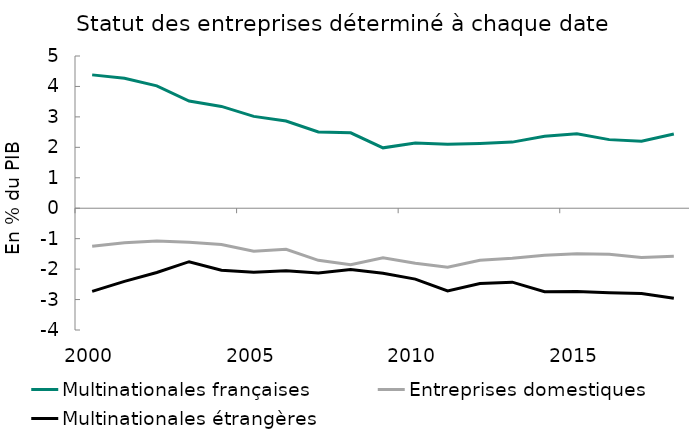
| Category | Multinationales françaises | Entreprises domestiques | Multinationales étrangères |
|---|---|---|---|
| 2000.0 | 4.38 | -1.249 | -2.729 |
| 2001.0 | 4.269 | -1.137 | -2.402 |
| 2002.0 | 4.02 | -1.078 | -2.112 |
| 2003.0 | 3.519 | -1.121 | -1.756 |
| 2004.0 | 3.344 | -1.193 | -2.034 |
| 2005.0 | 3.016 | -1.411 | -2.101 |
| 2006.0 | 2.866 | -1.352 | -2.053 |
| 2007.0 | 2.506 | -1.711 | -2.128 |
| 2008.0 | 2.476 | -1.853 | -2.016 |
| 2009.0 | 1.983 | -1.63 | -2.134 |
| 2010.0 | 2.142 | -1.804 | -2.328 |
| 2011.0 | 2.104 | -1.939 | -2.717 |
| 2012.0 | 2.129 | -1.71 | -2.471 |
| 2013.0 | 2.172 | -1.643 | -2.429 |
| 2014.0 | 2.361 | -1.548 | -2.744 |
| 2015.0 | 2.445 | -1.493 | -2.734 |
| 2016.0 | 2.253 | -1.51 | -2.776 |
| 2017.0 | 2.2 | -1.618 | -2.798 |
| 2018.0 | 2.435 | -1.578 | -2.958 |